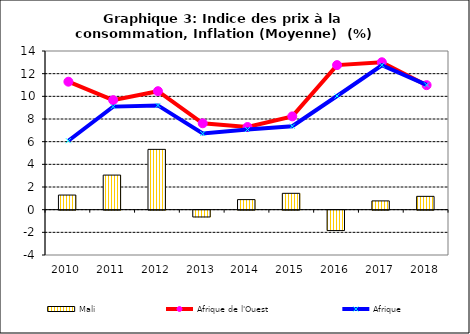
| Category | Mali |
|---|---|
| 2010.0 | 1.289 |
| 2011.0 | 3.051 |
| 2012.0 | 5.32 |
| 2013.0 | -0.601 |
| 2014.0 | 0.888 |
| 2015.0 | 1.442 |
| 2016.0 | -1.8 |
| 2017.0 | 0.774 |
| 2018.0 | 1.175 |